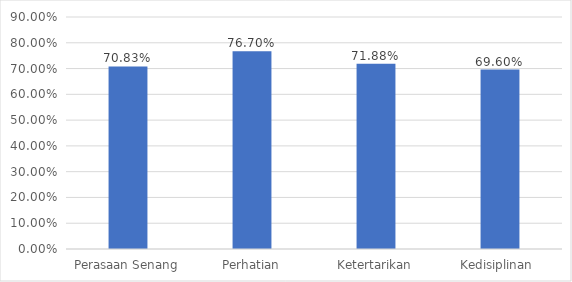
| Category | Series 0 |
|---|---|
| Perasaan Senang | 0.708 |
| Perhatian | 0.767 |
| Ketertarikan | 0.719 |
| Kedisiplinan  | 0.696 |